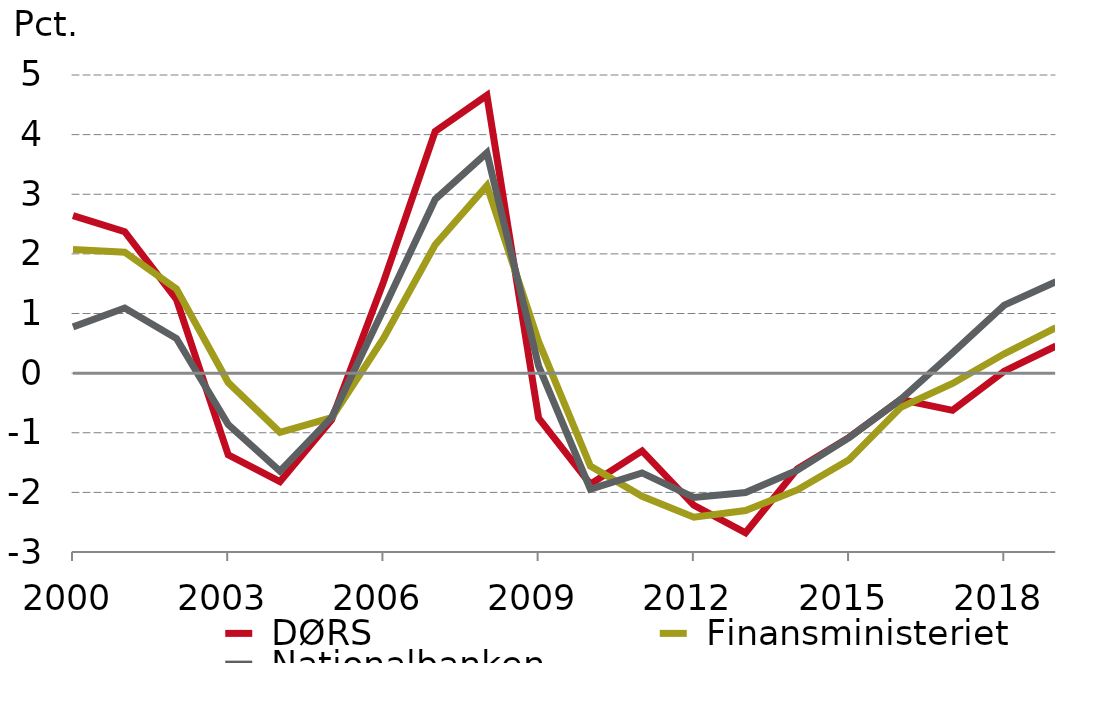
| Category |  DØRS |  Finansministeriet |  Nationalbanken | nullinje |
|---|---|---|---|---|
| 2000.0 | 2.643 | 2.071 | 0.776 | 0 |
| 2001.0 | 2.372 | 2.028 | 1.092 | 0 |
| 2002.0 | 1.238 | 1.413 | 0.581 | 0 |
| 2003.0 | -1.372 | -0.158 | -0.863 | 0 |
| 2004.0 | -1.821 | -0.992 | -1.644 | 0 |
| 2005.0 | -0.781 | -0.747 | -0.742 | 0 |
| 2006.0 | 1.526 | 0.582 | 1.068 | 0 |
| 2007.0 | 4.053 | 2.153 | 2.912 | 0 |
| 2008.0 | 4.659 | 3.144 | 3.694 | 0 |
| 2009.0 | -0.754 | 0.527 | 0.116 | 0 |
| 2010.0 | -1.862 | -1.557 | -1.947 | 0 |
| 2011.0 | -1.304 | -2.065 | -1.674 | 0 |
| 2012.0 | -2.217 | -2.417 | -2.085 | 0 |
| 2013.0 | -2.678 | -2.304 | -2.003 | 0 |
| 2014.0 | -1.605 | -1.959 | -1.629 | 0 |
| 2015.0 | -1.078 | -1.454 | -1.082 | 0 |
| 2016.0 | -0.443 | -0.574 | -0.438 | 0 |
| 2017.0 | -0.625 | -0.173 | 0.34 | 0 |
| 2018.0 | 0.032 | 0.325 | 1.141 | 0 |
| 2019.0 | 0.455 | 0.763 | 1.534 | 0 |